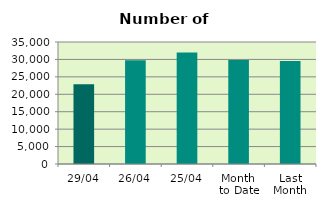
| Category | Series 0 |
|---|---|
| 29/04 | 22880 |
| 26/04 | 29782 |
| 25/04 | 31968 |
| Month 
to Date | 29852.211 |
| Last
Month | 29553.143 |